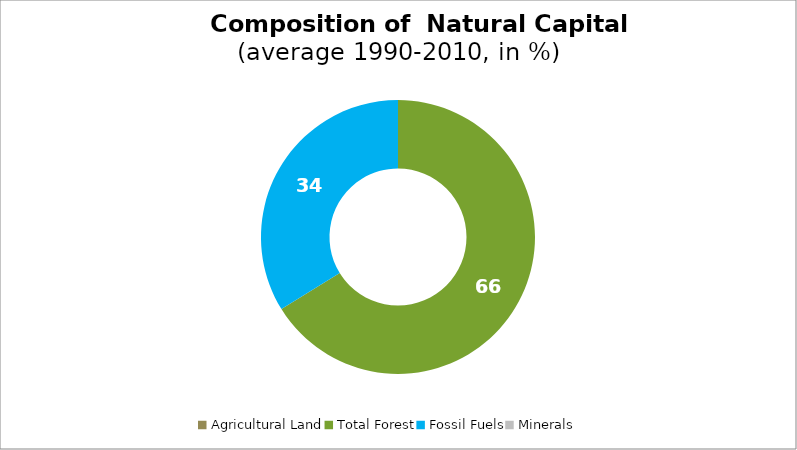
| Category | Series 0 |
|---|---|
| Agricultural Land | 0 |
| Total Forest | 66.192 |
| Fossil Fuels | 33.808 |
| Minerals | 0 |